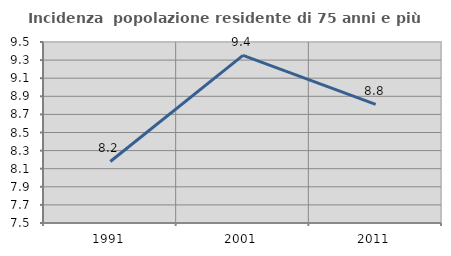
| Category | Incidenza  popolazione residente di 75 anni e più |
|---|---|
| 1991.0 | 8.18 |
| 2001.0 | 9.353 |
| 2011.0 | 8.811 |